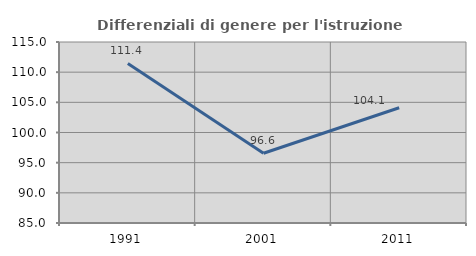
| Category | Differenziali di genere per l'istruzione superiore |
|---|---|
| 1991.0 | 111.442 |
| 2001.0 | 96.557 |
| 2011.0 | 104.096 |